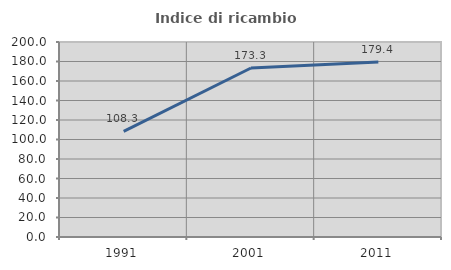
| Category | Indice di ricambio occupazionale  |
|---|---|
| 1991.0 | 108.333 |
| 2001.0 | 173.333 |
| 2011.0 | 179.412 |